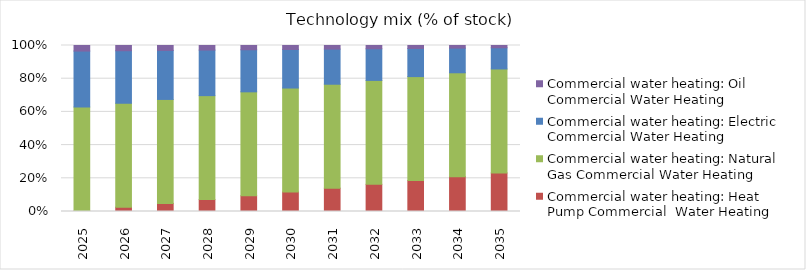
| Category | Commercial water heating: Heat Pump Commercial  Water Heating | Commercial water heating: Natural Gas Commercial Water Heating | Commercial water heating: Electric Commercial Water Heating | Commercial water heating: Oil Commercial Water Heating |
|---|---|---|---|---|
| 2025.0 | 0.003 | 0.626 | 0.337 | 0.034 |
| 2026.0 | 0.026 | 0.626 | 0.316 | 0.032 |
| 2027.0 | 0.049 | 0.626 | 0.295 | 0.03 |
| 2028.0 | 0.072 | 0.626 | 0.274 | 0.028 |
| 2029.0 | 0.095 | 0.626 | 0.253 | 0.026 |
| 2030.0 | 0.118 | 0.626 | 0.232 | 0.024 |
| 2031.0 | 0.14 | 0.626 | 0.212 | 0.022 |
| 2032.0 | 0.163 | 0.626 | 0.191 | 0.02 |
| 2033.0 | 0.186 | 0.626 | 0.17 | 0.018 |
| 2034.0 | 0.209 | 0.626 | 0.149 | 0.016 |
| 2035.0 | 0.232 | 0.626 | 0.128 | 0.014 |